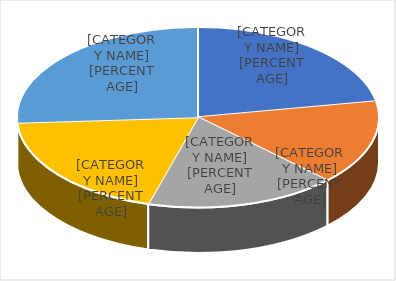
| Category | Series 0 |
|---|---|
| Large | 35 |
| Medium | 24 |
| Small | 27 |
| Nonhub | 31 |
| General Aviation | 41 |